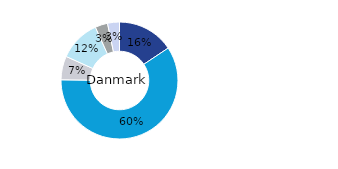
| Category | Danmark |
|---|---|
| Kontor | 0.156 |
| Bostäder | 0.595 |
| Handel | 0.065 |
| Logistik* | 0.115 |
| Samhällsfastigheter | 0.035 |
| Övrigt | 0.033 |